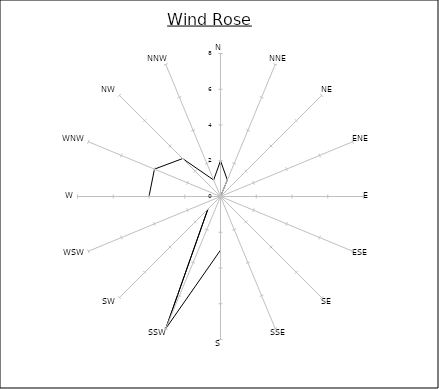
| Category | Series 0 |
|---|---|
| N | 2 |
| NNE | 1 |
| NE | 0 |
| ENE | 0 |
| E | 1 |
| ESE | 0 |
| SE | 1 |
| SSE | 0 |
| S | 3 |
| SSW | 8 |
| SW | 1 |
| WSW | 0 |
| W | 4 |
| WNW | 4 |
| NW | 3 |
| NNW | 1 |